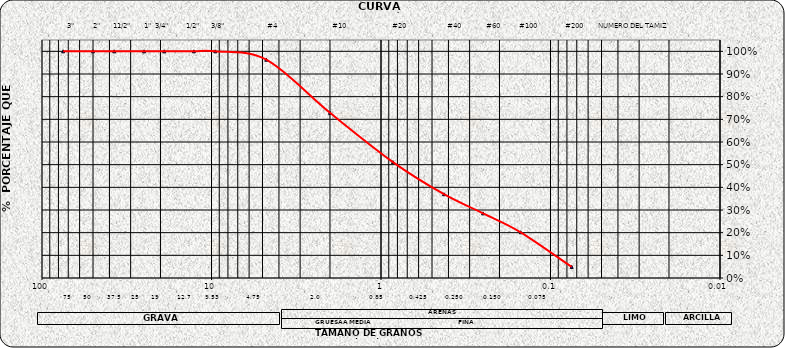
| Category | Series 0 |
|---|---|
| 75.0 | 1 |
| 50.0 | 1 |
| 37.5 | 1 |
| 25.0 | 1 |
| 19.0 | 1 |
| 12.7 | 1 |
| 9.5 | 1 |
| 4.75 | 0.963 |
| 2.0 | 0.729 |
| 0.85 | 0.511 |
| 0.425 | 0.37 |
| 0.25 | 0.285 |
| 0.15 | 0.202 |
| 0.075 | 0.049 |
| nan | 0 |